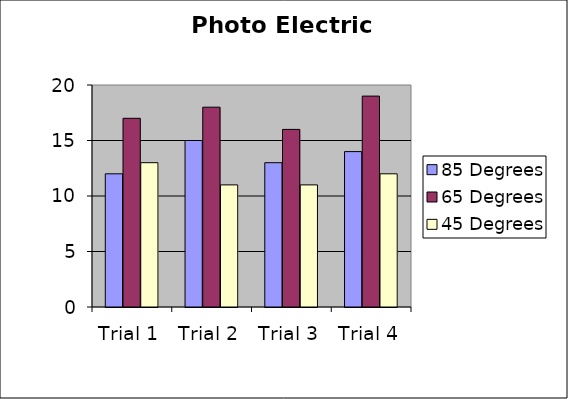
| Category | 85 Degrees | 65 Degrees | 45 Degrees |
|---|---|---|---|
| Trial 1 | 12 | 17 | 13 |
| Trial 2 | 15 | 18 | 11 |
| Trial 3 | 13 | 16 | 11 |
| Trial 4 | 14 | 19 | 12 |